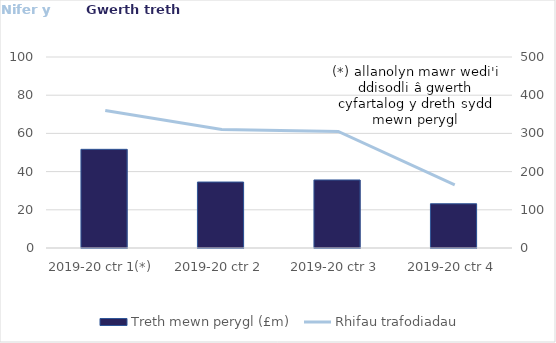
| Category | Treth mewn perygl (£m) |
|---|---|
| 2019-20 ctr 1(*) | 258278.17 |
| 2019-20 ctr 2 | 172680.76 |
| 2019-20 ctr 3 | 178123.44 |
| 2019-20 ctr 4 | 115808.61 |